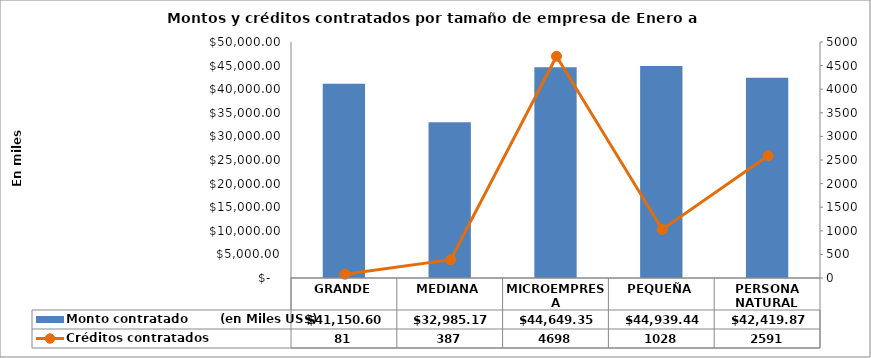
| Category | Monto contratado        (en Miles US$) |
|---|---|
| GRANDE | 41150.602 |
| MEDIANA | 32985.167 |
| MICROEMPRESA | 44649.348 |
| PEQUEÑA | 44939.44 |
| PERSONA NATURAL | 42419.866 |